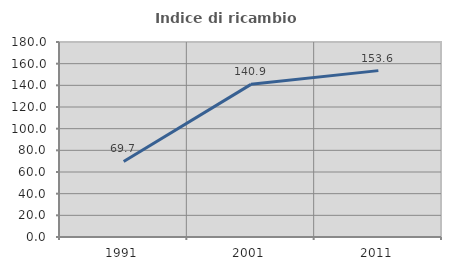
| Category | Indice di ricambio occupazionale  |
|---|---|
| 1991.0 | 69.697 |
| 2001.0 | 140.909 |
| 2011.0 | 153.571 |